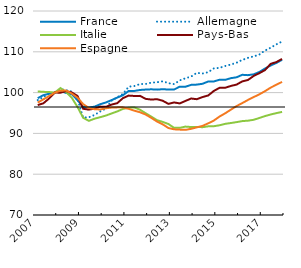
| Category | France | Allemagne | Italie | Pays-Bas | Espagne |
|---|---|---|---|---|---|
| 2007-03-01 | 98.652 | 98.161 | 100.285 | 96.941 | 97.558 |
| 2007-06-01 | 99.362 | 98.888 | 100.185 | 97.383 | 98.349 |
| 2007-09-01 | 99.726 | 99.725 | 100.148 | 98.557 | 99.147 |
| 2007-12-01 | 100 | 100 | 100 | 100 | 100 |
| 2008-03-01 | 100.365 | 100.878 | 101.11 | 99.986 | 100.456 |
| 2008-06-01 | 99.923 | 100.603 | 100.115 | 100.36 | 100.512 |
| 2008-09-01 | 99.602 | 100.239 | 98.716 | 100.033 | 99.753 |
| 2008-12-01 | 98.144 | 98.301 | 96.477 | 99.176 | 98.748 |
| 2009-03-01 | 96.506 | 93.891 | 93.821 | 96.035 | 97.169 |
| 2009-06-01 | 96.349 | 93.96 | 93.076 | 95.824 | 96.228 |
| 2009-09-01 | 96.555 | 94.521 | 93.607 | 96.082 | 95.928 |
| 2009-12-01 | 97.152 | 95.387 | 93.975 | 96.564 | 95.868 |
| 2010-03-01 | 97.585 | 96.087 | 94.371 | 96.503 | 96.158 |
| 2010-06-01 | 98.159 | 98.055 | 94.889 | 97.057 | 96.333 |
| 2010-09-01 | 98.781 | 98.852 | 95.39 | 97.421 | 96.379 |
| 2010-12-01 | 99.356 | 99.678 | 96.002 | 98.641 | 96.378 |
| 2011-03-01 | 100.402 | 101.439 | 96.299 | 99.268 | 96.03 |
| 2011-06-01 | 100.405 | 101.616 | 96.361 | 99.177 | 95.57 |
| 2011-09-01 | 100.643 | 102.098 | 95.798 | 99.197 | 95.182 |
| 2011-12-01 | 100.743 | 102.117 | 94.935 | 98.464 | 94.617 |
| 2012-03-01 | 100.805 | 102.44 | 94.101 | 98.293 | 93.796 |
| 2012-06-01 | 100.727 | 102.538 | 93.239 | 98.382 | 92.904 |
| 2012-09-01 | 100.833 | 102.774 | 92.819 | 98.001 | 92.217 |
| 2012-12-01 | 100.748 | 102.312 | 92.301 | 97.242 | 91.316 |
| 2013-03-01 | 100.755 | 102.085 | 91.354 | 97.584 | 91.003 |
| 2013-06-01 | 101.455 | 102.99 | 91.362 | 97.348 | 90.927 |
| 2013-09-01 | 101.443 | 103.512 | 91.669 | 97.96 | 90.865 |
| 2013-12-01 | 101.894 | 103.935 | 91.559 | 98.552 | 91.124 |
| 2014-03-01 | 101.959 | 104.849 | 91.593 | 98.382 | 91.484 |
| 2014-06-01 | 102.157 | 104.672 | 91.523 | 98.907 | 91.838 |
| 2014-09-01 | 102.717 | 105.007 | 91.732 | 99.295 | 92.462 |
| 2014-12-01 | 102.732 | 105.941 | 91.763 | 100.414 | 93.156 |
| 2015-03-01 | 103.156 | 106.059 | 91.993 | 101.177 | 94.136 |
| 2015-06-01 | 103.129 | 106.532 | 92.342 | 101.194 | 94.935 |
| 2015-09-01 | 103.54 | 106.876 | 92.549 | 101.631 | 95.827 |
| 2015-12-01 | 103.753 | 107.328 | 92.766 | 101.97 | 96.706 |
| 2016-03-01 | 104.362 | 108.007 | 93.017 | 102.743 | 97.43 |
| 2016-06-01 | 104.274 | 108.509 | 93.116 | 103.096 | 98.197 |
| 2016-09-01 | 104.48 | 108.873 | 93.335 | 104.082 | 98.898 |
| 2016-12-01 | 105.046 | 109.325 | 93.775 | 104.76 | 99.573 |
| 2017-03-01 | 105.899 | 110.309 | 94.244 | 105.52 | 100.356 |
| 2017-06-01 | 106.646 | 111.007 | 94.633 | 107.051 | 101.224 |
| 2017-09-01 | 107.272 | 111.824 | 94.973 | 107.486 | 101.928 |
| 2017-12-01 | 108.042 | 112.502 | 95.263 | 108.259 | 102.618 |